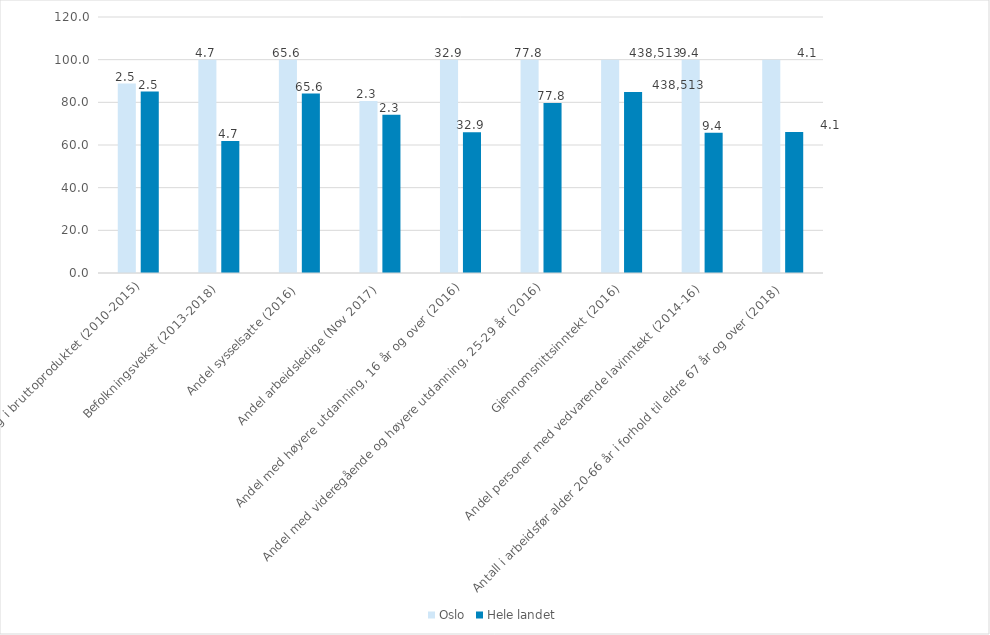
| Category | Oslo | Hele landet |
|---|---|---|
| Endring i bruttoproduktet (2010-2015) | 88.801 | 85.077 |
| Befolkningsvekst (2013-2018) | 100 | 61.842 |
| Andel sysselsatte (2016) | 100 | 84.127 |
| Andel arbeidsledige (Nov 2017) | 80.645 | 74.194 |
| Andel med høyere utdanning, 16 år og over (2016) | 100 | 65.932 |
| Andel med videregående og høyere utdanning, 25-29 år (2016) | 100 | 79.656 |
| Gjennomsnittsinntekt (2016) | 100 | 84.798 |
| Andel personer med vedvarende lavinntekt (2014-16) | 100 | 65.734 |
| Antall i arbeidsfør alder 20-66 år i forhold til eldre 67 år og over (2018) | 100 | 66.129 |